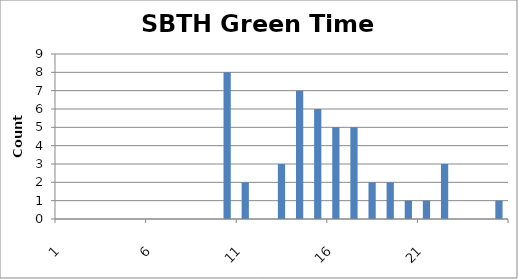
| Category | Series 0 |
|---|---|
| 0 | 0 |
| 1 | 0 |
| 2 | 0 |
| 3 | 0 |
| 4 | 0 |
| 5 | 0 |
| 6 | 0 |
| 7 | 0 |
| 8 | 0 |
| 9 | 8 |
| 10 | 2 |
| 11 | 0 |
| 12 | 3 |
| 13 | 7 |
| 14 | 6 |
| 15 | 5 |
| 16 | 5 |
| 17 | 2 |
| 18 | 2 |
| 19 | 1 |
| 20 | 1 |
| 21 | 3 |
| 22 | 0 |
| 23 | 0 |
| 24 | 1 |